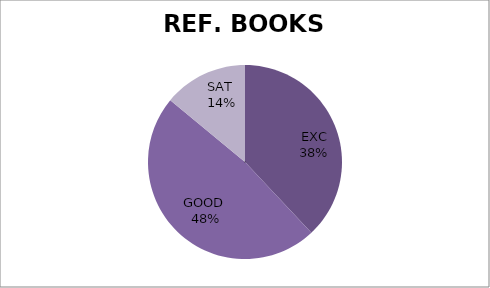
| Category | Series 0 |
|---|---|
| EXC | 38 |
| GOOD  | 48 |
| SAT  | 14 |